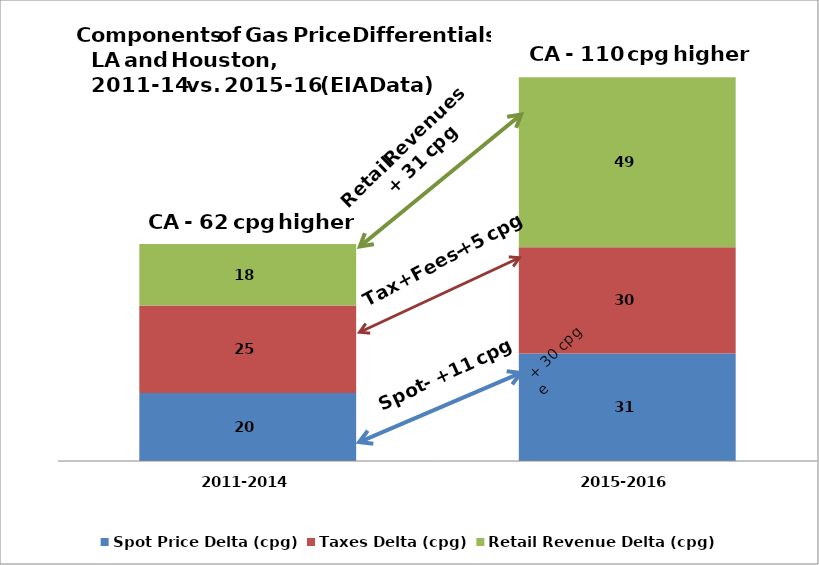
| Category | Spot Price Delta (cpg) | Taxes Delta (cpg) | Retail Revenue Delta (cpg) |
|---|---|---|---|
| 2011-2014 | 19.53 | 25.141 | 17.619 |
| 2015-2016 | 30.877 | 30.485 | 48.773 |